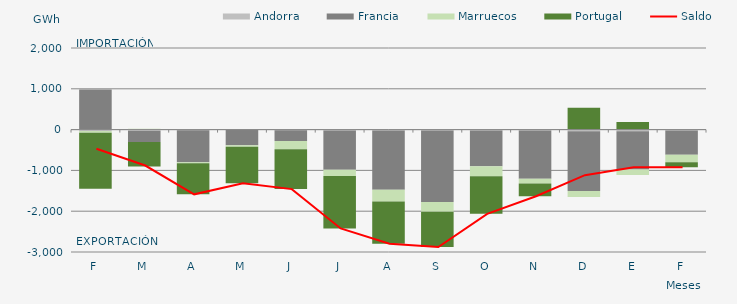
| Category | Andorra | Francia | Marruecos | Portugal |
|---|---|---|---|---|
| F | -34.803 | 984.059 | -44.168 | -1373 |
| M | -31.125 | -269.834 | 22.023 | -601.362 |
| A | -16.536 | -782.912 | -22.588 | -764.882 |
| M | -5.354 | -378.96 | -37.987 | -891.537 |
| J | -16.539 | -262.937 | -205.078 | -974.176 |
| J | -22.256 | -963.789 | -152.863 | -1283.78 |
| A | -20.355 | -1451.936 | -291.598 | -1034.215 |
| S | -19.779 | -1752.3 | -243.405 | -861.179 |
| O | -20.359 | -877.448 | -247.178 | -920.502 |
| N | -20.176 | -1184.993 | -114.159 | -314.568 |
| D | -39.88 | -1462.427 | -149.967 | 535.045 |
| E | -42.454 | -936.901 | -131.692 | 188.334 |
| F | -21.206 | -592.499 | -187.112 | -122.026 |